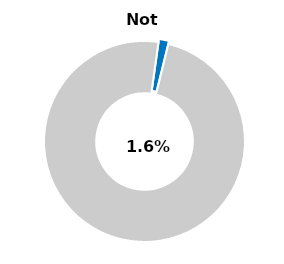
| Category | Series 0 |
|---|---|
| Not passed | 0.016 |
| Other | 0.984 |